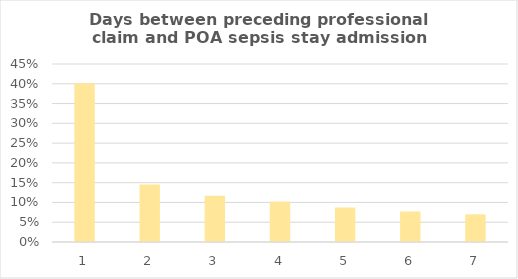
| Category | Number of days between preceeding professional claim and Acute IP admission |
|---|---|
| 1.0 | 0.401 |
| 2.0 | 0.145 |
| 3.0 | 0.117 |
| 4.0 | 0.102 |
| 5.0 | 0.087 |
| 6.0 | 0.077 |
| 7.0 | 0.07 |